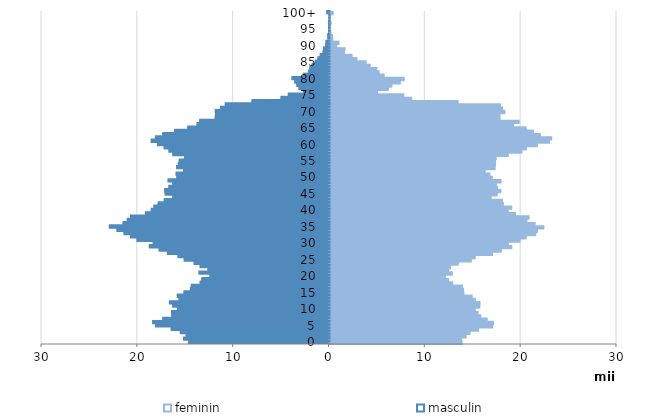
| Category | feminin | masculin |
|---|---|---|
| 0 | 13774.922 | -14671.586 |
| 1 | 13729.507 | -15181.126 |
| 2 | 14197.005 | -14920.608 |
| 3 | 14620.843 | -15521.709 |
| 4 | 15489.821 | -16468.995 |
| 5 | 16972.091 | -18114.541 |
| 6 | 17064.106 | -18410.702 |
| 7 | 16403.919 | -17362.838 |
| 8 | 15735.448 | -16419.317 |
| 9 | 15439.748 | -16441.303 |
| 10 | 15154.552 | -15805.105 |
| 11 | 15621.261 | -16319.443 |
| 12 | 15642.333 | -16656.53 |
| 13 | 15168.574 | -15659.706 |
| 14 | 14828.607 | -15837.787 |
| 15 | 13965.889 | -15142.572 |
| 16 | 13940.441 | -14466.707 |
| 17 | 13823.112 | -14375.887 |
| 18 | 12793.864 | -13456.209 |
| 19 | 12383.368 | -13283.658 |
| 20 | 12035.79 | -12433.997 |
| 21 | 12756.374 | -13578.458 |
| 22 | 12379.752 | -12637.173 |
| 23 | 12559.004 | -13454.15 |
| 24 | 13383.445 | -14080.041 |
| 25 | 14747.162 | -15113.796 |
| 26 | 15145.738 | -15762.927 |
| 27 | 16964.107 | -16861.962 |
| 28 | 17884.427 | -17736.089 |
| 29 | 18965.375 | -18755.337 |
| 30 | 18607.672 | -18354.473 |
| 31 | 19834.697 | -20047.152 |
| 32 | 20462.156 | -20708.766 |
| 33 | 21479.289 | -21400.169 |
| 34 | 21645.379 | -22127.884 |
| 35 | 22311.05 | -22925.599 |
| 36 | 21403.946 | -21496.38 |
| 37 | 20548.676 | -21058.97 |
| 38 | 20771.277 | -20715.974 |
| 39 | 19346.122 | -19153.31 |
| 40 | 18594.698 | -18553.586 |
| 41 | 18960.935 | -18272.784 |
| 42 | 18095.541 | -17829.29 |
| 43 | 17982.317 | -17192.307 |
| 44 | 16819.726 | -16317.778 |
| 45 | 17444.651 | -17101.577 |
| 46 | 17824.705 | -17157.543 |
| 47 | 17482.848 | -16722.696 |
| 48 | 17360.179 | -16313.54 |
| 49 | 17846.215 | -16801.602 |
| 50 | 16932.83 | -15895.968 |
| 51 | 16690.227 | -15958.268 |
| 52 | 16178.321 | -15178.531 |
| 53 | 17228.239 | -15909.211 |
| 54 | 17260.507 | -15726.232 |
| 55 | 17271.091 | -15631.335 |
| 56 | 17334.544 | -15081.094 |
| 57 | 18604.788 | -16303.342 |
| 58 | 20017.442 | -16712.447 |
| 59 | 20485.832 | -17207.497 |
| 60 | 21635.264 | -17894.945 |
| 61 | 22888.774 | -18563.996 |
| 62 | 23130.02 | -18116.908 |
| 63 | 21956.311 | -17357.529 |
| 64 | 21215.084 | -16106.222 |
| 65 | 20454.205 | -14742.205 |
| 66 | 19147.251 | -13778.855 |
| 67 | 19736.778 | -13495.431 |
| 68 | 17747.236 | -11884.823 |
| 69 | 17724.48 | -11849.775 |
| 70 | 18246.902 | -11877.844 |
| 71 | 17996.348 | -11336.183 |
| 72 | 17782.002 | -10827.583 |
| 73 | 13362.394 | -8040.409 |
| 74 | 8529.329 | -5024.012 |
| 75 | 7692.245 | -4247.763 |
| 76 | 4955.122 | -2674.342 |
| 77 | 6088.807 | -3143.19 |
| 78 | 6443.592 | -3366.233 |
| 79 | 7336.039 | -3581.587 |
| 80 | 7740.866 | -3870.848 |
| 81 | 5635.022 | -2646.724 |
| 82 | 5123 | -2149.391 |
| 83 | 4887.047 | -1999.036 |
| 84 | 4189.282 | -1767.065 |
| 85 | 3770.214 | -1436.906 |
| 86 | 2804 | -1168.561 |
| 87 | 2291.475 | -924.839 |
| 88 | 1510.527 | -623.553 |
| 89 | 1562.756 | -574.779 |
| 90 | 699 | -352 |
| 91 | 937 | -319.375 |
| 92 | 283.129 | -112.71 |
| 93 | 263 | -135.239 |
| 94 | 81.636 | -37.257 |
| 95 | 51.647 | -52.621 |
| 96 | 2 | -37 |
| 97 | 113 | -59 |
| 98 | 3 | -9.404 |
| 99 | 60 | -8.182 |
| 100+ | 323.816 | -239 |